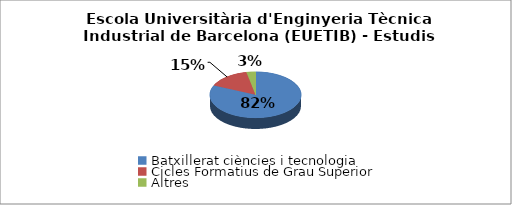
| Category | Escola Universitària d'Enginyeria Tècnica Industrial de Barcelona (EUETIB) - Estudis cursats |
|---|---|
| Batxillerat ciències i tecnologia | 0.817 |
| Cicles Formatius de Grau Superior | 0.151 |
| Altres | 0.032 |